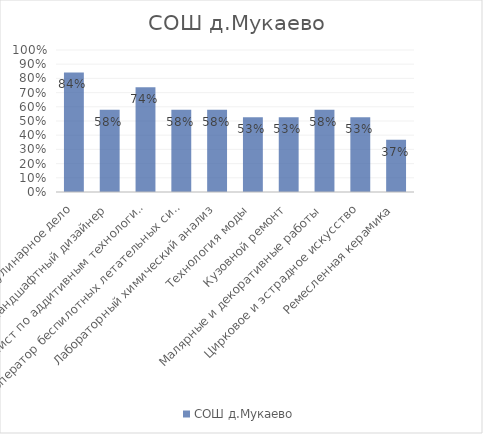
| Category | СОШ д.Мукаево |
|---|---|
| Кулинарное дело | 0.842 |
| Ландшафтный дизайнер | 0.579 |
| Специалист по аддитивным технологиям | 0.737 |
| Оператор беспилотных летательных систем | 0.579 |
| Лабораторный химический анализ | 0.579 |
| Технология моды | 0.526 |
| Кузовной ремонт | 0.526 |
| Малярные и декоративные работы | 0.579 |
| Цирковое и эстрадное искусство | 0.526 |
| Ремесленная керамика | 0.368 |